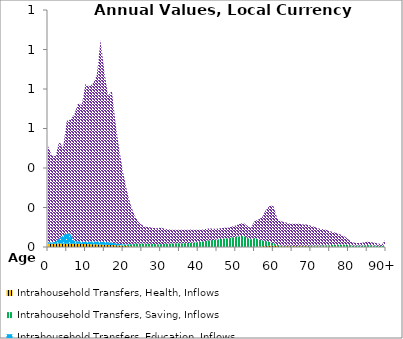
| Category | Intrahousehold Transfers, Health, Inflows | Intrahousehold Transfers, Saving, Inflows | Intrahousehold Transfers, Education, Inflows | Intrahousehold Transfers, Consumption other than health and education, Inflows |
|---|---|---|---|---|
| 0 | 16.634 | 0 | 7.078 | 487.3 |
|  | 16.879 | 0 | 6.59 | 440.461 |
| 2 | 16.997 | 0 | 8.706 | 434.236 |
| 3 | 17.363 | 0 | 27.784 | 490.527 |
| 4 | 16.833 | 0 | 40.402 | 444.37 |
| 5 | 16.994 | 0 | 54.476 | 567.299 |
| 6 | 17.011 | 0 | 48.545 | 580.13 |
| 7 | 16.695 | 0 | 13.168 | 641.19 |
| 8 | 16.458 | 0 | 12.667 | 698.435 |
| 9 | 15.687 | 0 | 10.71 | 693.199 |
| 10 | 15.069 | 0 | 11.75 | 800.992 |
| 11 | 14.43 | 0 | 12.836 | 785.903 |
| 12 | 13.629 | 0 | 13.616 | 800.867 |
| 13 | 13.051 | 0 | 14.468 | 842.701 |
| 14 | 12.154 | 0 | 14.886 | 1020.719 |
| 15 | 11.571 | 0 | 14.474 | 863.119 |
| 16 | 10.67 | 0 | 13.432 | 741.252 |
| 17 | 10.012 | 0 | 12.067 | 769.158 |
| 18 | 8.963 | 0 | 9.59 | 607.643 |
| 19 | 7.847 | 0.207 | 6.886 | 474.415 |
| 20 | 6.145 | 3.524 | 4.681 | 363.427 |
| 21 | 4.749 | 6.789 | 2.976 | 271.379 |
| 22 | 3.456 | 10.076 | 1.779 | 199.067 |
| 23 | 2.304 | 12.732 | 1.117 | 145.691 |
| 24 | 1.336 | 15.552 | 0.699 | 111.548 |
| 25 | 0.894 | 17.001 | 0.403 | 93.121 |
| 26 | 0.808 | 16.302 | 0.317 | 84.719 |
| 27 | 0.867 | 15.17 | 0.294 | 83.972 |
| 28 | 0.799 | 14.473 | 0.266 | 81.064 |
| 29 | 0.705 | 13.331 | 0.249 | 80.485 |
| 30 | 0.613 | 13.909 | 0.239 | 83.474 |
| 31 | 0.381 | 15.177 | 0.158 | 77.259 |
| 32 | 0.217 | 16.938 | 0.093 | 71.593 |
| 33 | 0.157 | 17.726 | 0.063 | 69.902 |
| 34 | 0.095 | 18.917 | 0.032 | 68.209 |
| 35 | 0.03 | 19.46 | 0.001 | 67.438 |
| 36 | 0.023 | 19.27 | 0 | 67.988 |
| 37 | 0.017 | 19.828 | 0 | 67.514 |
| 38 | 0.01 | 21.382 | 0 | 66.669 |
| 39 | 0.005 | 22.926 | 0 | 64.414 |
| 40 | 0.003 | 25.149 | 0 | 62.484 |
| 41 | 0.002 | 27.803 | 0 | 60.562 |
| 42 | 0 | 30.962 | 0 | 60.309 |
| 43 | 0 | 34.05 | 0 | 60.078 |
| 44 | 0 | 35.274 | 0 | 56.824 |
| 45 | 0 | 37.777 | 0 | 54.986 |
| 46 | 0 | 40.629 | 0 | 53.989 |
| 47 | 0 | 43.567 | 0 | 54.293 |
| 48 | 0 | 44.671 | 0 | 53.062 |
| 49 | 0 | 48.544 | 0.001 | 55.523 |
| 50 | 0 | 51.481 | 0.003 | 57.575 |
| 51 | 0.022 | 54.639 | 0.008 | 62.059 |
| 52 | 0.045 | 56.3 | 0.016 | 66.711 |
| 53 | 0.114 | 47.474 | 0.021 | 60.585 |
| 54 | 0.302 | 38.14 | 0.03 | 57.344 |
| 55 | 0.994 | 44.49 | 0.061 | 85.629 |
| 56 | 1.717 | 38.38 | 0.08 | 98.904 |
| 57 | 2.862 | 31.028 | 0.108 | 116.684 |
| 58 | 4.655 | 26.239 | 0.155 | 155.578 |
| 59 | 6.173 | 19.31 | 0.183 | 183.62 |
| 60 | 6.439 | 12.613 | 0.182 | 188.681 |
| 61 | 4.678 | 5.79 | 0.127 | 136.266 |
| 62 | 3.939 | 3.727 | 0.107 | 122.636 |
| 63 | 3.589 | 3.091 | 0.096 | 119.166 |
| 64 | 3.374 | 2.586 | 0.088 | 113.981 |
| 65 | 3.398 | 2.325 | 0.083 | 112.276 |
| 66 | 3.459 | 2.041 | 0.076 | 112.308 |
| 67 | 3.653 | 2.083 | 0.07 | 112.177 |
| 68 | 3.629 | 2.4 | 0.058 | 107.539 |
| 69 | 3.398 | 3.258 | 0.046 | 107.077 |
| 70 | 3.042 | 3.987 | 0.032 | 100.596 |
| 71 | 2.773 | 4.782 | 0.022 | 94.092 |
| 72 | 2.54 | 5.156 | 0.013 | 86.39 |
| 73 | 2.44 | 5.81 | 0.008 | 82.523 |
| 74 | 2.594 | 6.313 | 0.005 | 78.535 |
| 75 | 2.42 | 6.985 | 0.003 | 70.795 |
| 76 | 2.154 | 8.67 | 0.002 | 64.853 |
| 77 | 1.756 | 10.048 | 0.001 | 57.447 |
| 78 | 1.363 | 11.084 | 0 | 49.978 |
| 79 | 0.813 | 12.076 | 0 | 40.585 |
| 80 | 0.38 | 10.391 | 0 | 27.109 |
| 81 | 0.156 | 7.235 | 0 | 16.189 |
| 82 | 0.081 | 6.97 | 0 | 13.753 |
| 83 | 0.028 | 7.284 | 0 | 12.926 |
| 84 | 0.016 | 8.233 | 0 | 14.328 |
| 85 | 0.008 | 9.735 | 0 | 17.045 |
| 86 | 0.002 | 8.857 | 0 | 15.556 |
| 87 | 0 | 7.78 | 0 | 13.713 |
| 88 | 0 | 6.169 | 0 | 10.869 |
| 89 | 0 | 5.294 | 0 | 9.247 |
| 90+ | 0 | 15.226 | 0 | 26.365 |